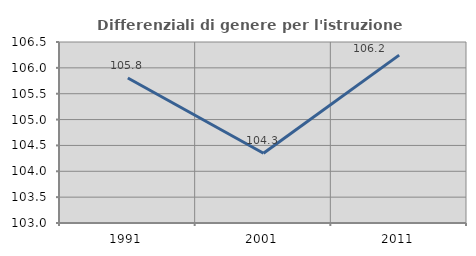
| Category | Differenziali di genere per l'istruzione superiore |
|---|---|
| 1991.0 | 105.804 |
| 2001.0 | 104.348 |
| 2011.0 | 106.247 |